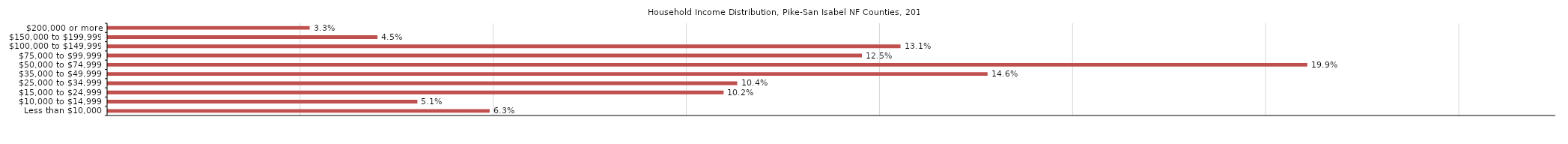
| Category | Household Income Distribution |
|---|---|
| Less than $10,000 | 0.049 |
| $10,000 to $14,999 | 0.05 |
| $15,000 to $24,999 | 0.101 |
| $25,000 to $34,999 | 0.122 |
| $35,000 to $49,999 | 0.152 |
| $50,000 to $74,999 | 0.2 |
| $75,000 to $99,999 | 0.137 |
| $100,000 to $149,999 | 0.118 |
| $150,000 to $199,999 | 0.033 |
| $200,000 or more | 0.037 |